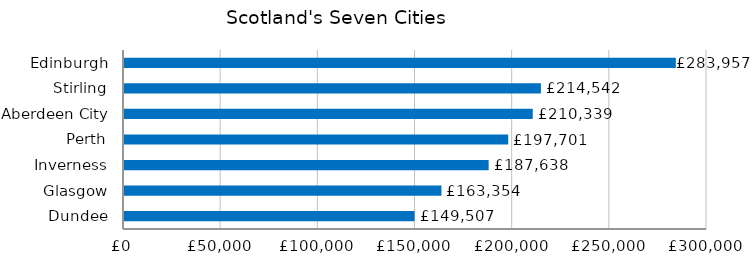
| Category | Series 0 |
|---|---|
| Dundee | 149506.797 |
| Glasgow | 163354.168 |
| Inverness | 187637.53 |
| Perth | 197701.442 |
| Aberdeen City | 210339.429 |
| Stirling | 214542.059 |
| Edinburgh | 283957.35 |